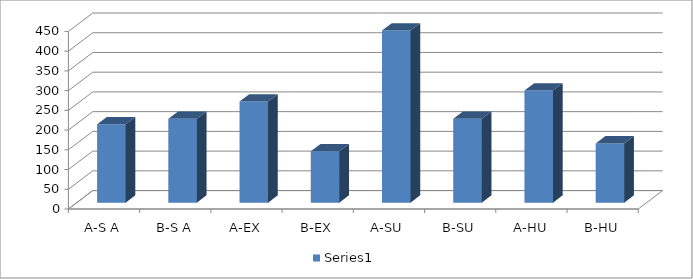
| Category | Series 0 |
|---|---|
| A-S A | 198.527 |
| B-S A | 212.661 |
| A-EX | 256.296 |
| B-EX | 130.246 |
| A-SU | 436.148 |
| B-SU | 212.709 |
| A-HU | 284.265 |
| B-HU | 150 |